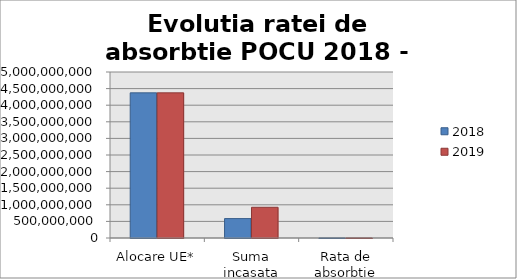
| Category | 2018 | 2019 |
|---|---|---|
| Alocare UE* | 4371963027 | 4371963027 |
| Suma incasata pentru aplicatii intermediare | 584933097 | 924801773.49 |
| Rata de absorbtie efectiva | 0.134 | 0.212 |